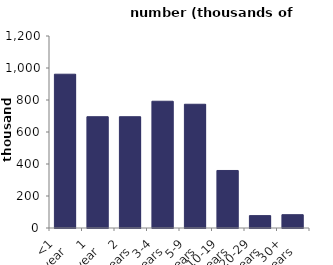
| Category | time in current accommodation |
|---|---|
| <1 
year | 961.194 |
| 1 
year | 695.574 |
| 2 
years | 695.579 |
| 3-4 
years | 792.226 |
| 5-9 
years | 773.349 |
| 10-19 
years | 359.519 |
| 20-29 
years | 77.375 |
| 30+ 
years | 83.125 |